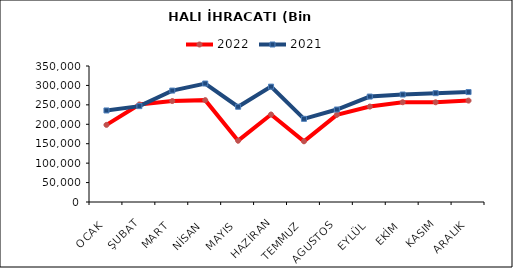
| Category | 2022 | 2021 |
|---|---|---|
| OCAK | 198477.641 | 235590.768 |
| ŞUBAT | 251000.235 | 246725.434 |
| MART | 259806.359 | 286759.179 |
| NİSAN | 262164.347 | 304914.442 |
| MAYIS | 157792.492 | 245146.346 |
| HAZİRAN | 225209.32 | 296918.054 |
| TEMMUZ | 156205.388 | 214045.725 |
| AGUSTOS | 224283.589 | 237973.084 |
| EYLÜL | 245560.094 | 271360.615 |
| EKİM | 256743.386 | 276585.442 |
| KASIM | 256596.027 | 280147.27 |
| ARALIK | 260917.994 | 282936.118 |